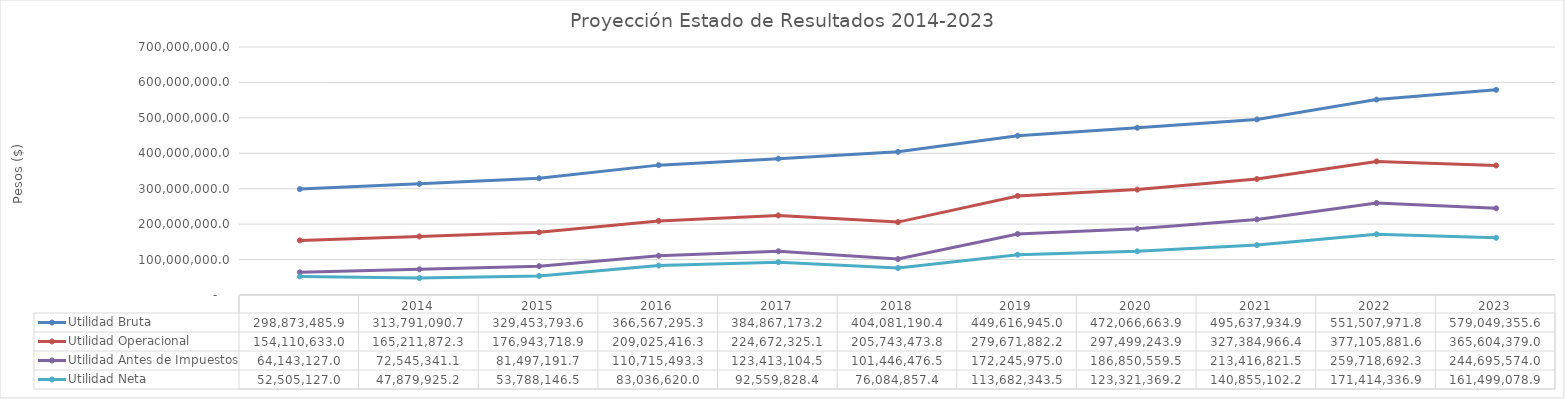
| Category | Utilidad Bruta | Utilidad Operacional | Utilidad Antes de Impuestos | Utilidad Neta |
|---|---|---|---|---|
| nan | 298873485.855 | 154110633.025 | 64143127 | 52505127 |
| 2014.0 | 313791090.661 | 165211872.343 | 72545341.138 | 47879925.151 |
| 2015.0 | 329453793.623 | 176943718.853 | 81497191.711 | 53788146.529 |
| 2016.0 | 366567295.263 | 209025416.288 | 110715493.332 | 83036619.999 |
| 2017.0 | 384867173.194 | 224672325.147 | 123413104.502 | 92559828.377 |
| 2018.0 | 404081190.417 | 205743473.81 | 101446476.546 | 76084857.409 |
| 2019.0 | 449616944.964 | 279671882.158 | 172245974.976 | 113682343.484 |
| 2020.0 | 472066663.882 | 297499243.859 | 186850559.462 | 123321369.245 |
| 2021.0 | 495637934.896 | 327384966.44 | 213416821.51 | 140855102.197 |
| 2022.0 | 551507971.75 | 377105881.59 | 259718692.313 | 171414336.926 |
| 2023.0 | 579049355.571 | 365604378.988 | 244695574.032 | 161499078.861 |